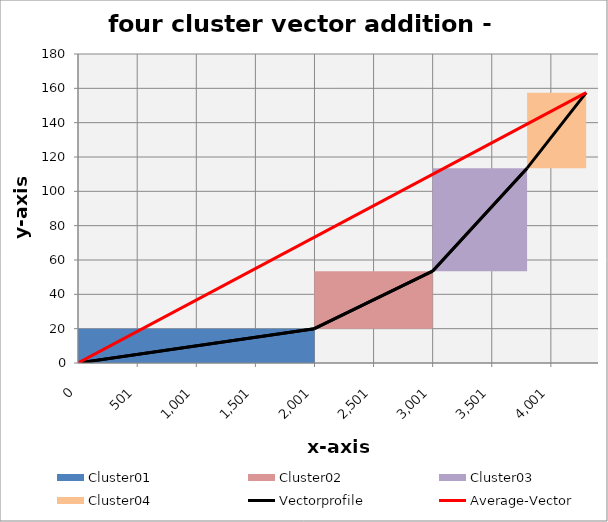
| Category | transparent | Cluster01 | Cluster02 | Cluster03 | Cluster04 | Border right & top |
|---|---|---|---|---|---|---|
| 0.0 | 0 | 20 | 0 | 0 | 0 | 0 |
| 2000.0 | 0 | 20 | 0 | 0 | 0 | 0 |
| 2000.0 | 20 | 0 | 33.5 | 0 | 0 | 0 |
| 3000.0 | 20 | 0 | 33.5 | 0 | 0 | 0 |
| 3000.0 | 53.5 | 0 | 0 | 60 | 0 | 0 |
| 3800.0 | 53.5 | 0 | 0 | 60 | 0 | 0 |
| 3800.0 | 113.5 | 0 | 0 | 0 | 44 | 0 |
| 4300.0 | 113.5 | 0 | 0 | 0 | 44 | 0 |
| 4300.0 | 157.5 | 0 | 0 | 0 | 0 | 0 |
| 4300.0 | 157.5 | 0 | 0 | 0 | 0 | 0 |
| 4300.0 | 157.5 | 0 | 0 | 0 | 0 | 0 |
| 4300.0 | 157.5 | 0 | 0 | 0 | 0 | 0 |
| 4300.0 | 157.5 | 0 | 0 | 0 | 0 | 0 |
| 4300.0 | 157.5 | 0 | 0 | 0 | 0 | 0 |
| 4300.0 | 157.5 | 0 | 0 | 0 | 0 | 0 |
| 4300.0 | 157.5 | 0 | 0 | 0 | 0 | 0 |
| 4300.0 | 157.5 | 0 | 0 | 0 | 0 | 0 |
| 4300.0 | 157.5 | 0 | 0 | 0 | 0 | 0 |
| 4300.0 | 157.5 | 0 | 0 | 0 | 0 | 0 |
| 4300.0 | 157.5 | 0 | 0 | 0 | 0 | 0 |
| 4300.0 | 157.5 | 0 | 0 | 0 | 0 | 0 |
| 4400.0 | 157.5 | 0 | 0 | 0 | 0 | 0 |
| 4400.0 | 157.5 | 0 | 0 | 0 | 0 | 0 |